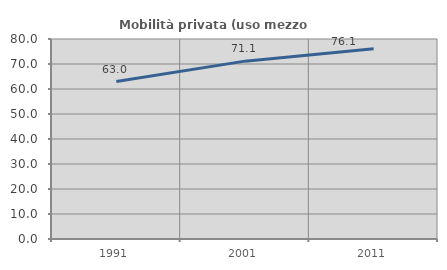
| Category | Mobilità privata (uso mezzo privato) |
|---|---|
| 1991.0 | 62.973 |
| 2001.0 | 71.143 |
| 2011.0 | 76.077 |